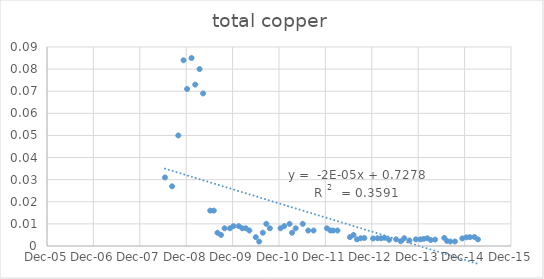
| Category | Series 0 |
|---|---|
| 39618.0 | 0.031 |
| 39674.0 | 0.027 |
| 39723.0 | 0.05 |
| 39764.0 | 0.084 |
| 39792.0 | 0.071 |
| 39827.0 | 0.085 |
| 39856.0 | 0.073 |
| 39890.0 | 0.08 |
| 39918.0 | 0.069 |
| 39974.0 | 0.016 |
| 40002.0 | 0.016 |
| 40031.0 | 0.006 |
| 40059.0 | 0.005 |
| 40087.0 | 0.008 |
| 40129.0 | 0.008 |
| 40157.0 | 0.009 |
| 40198.0 | 0.009 |
| 40226.0 | 0.008 |
| 40282.0 | 0.007 |
| 40254.0 | 0.008 |
| 40332.0 | 0.004 |
| 40359.0 | 0.002 |
| 40388.0 | 0.006 |
| 40415.0 | 0.01 |
| 40443.0 | 0.008 |
| 40527.0 | 0.008 |
| 40556.0 | 0.009 |
| 40598.0 | 0.01 |
| 40618.0 | 0.006 |
| 40646.0 | 0.008 |
| 40702.0 | 0.01 |
| 40745.0 | 0.007 |
| 40787.0 | 0.007 |
| 40892.0 | 0.008 |
| 40920.0 | 0.007 |
| 40941.0 | 0.007 |
| 40975.0 | 0.007 |
| 41073.0 | 0.004 |
| 41101.0 | 0.005 |
| 41129.0 | 0.003 |
| 41158.0 | 0.004 |
| 41186.0 | 0.004 |
| 41255.0 | 0.003 |
| 41290.0 | 0.004 |
| 41318.0 | 0.004 |
| 41346.0 | 0.004 |
| 41381.0 | 0.003 |
| 41436.0 | 0.003 |
| 41472.0 | 0.002 |
| 41500.0 | 0.004 |
| 41541.0 | 0.002 |
| 41592.0 | 0.003 |
| 41626.0 | 0.003 |
| 41653.0 | 0.003 |
| 41682.0 | 0.004 |
| 41709.0 | 0.003 |
| 41743.0 | 0.003 |
| 41815.0 | 0.004 |
| 41836.0 | 0.002 |
| 41863.0 | 0.002 |
| 41899.0 | 0.002 |
| 41957.0 | 0.003 |
| 41989.0 | 0.004 |
| 42017.0 | 0.004 |
| 42052.0 | 0.004 |
| 42080.0 | 0.003 |